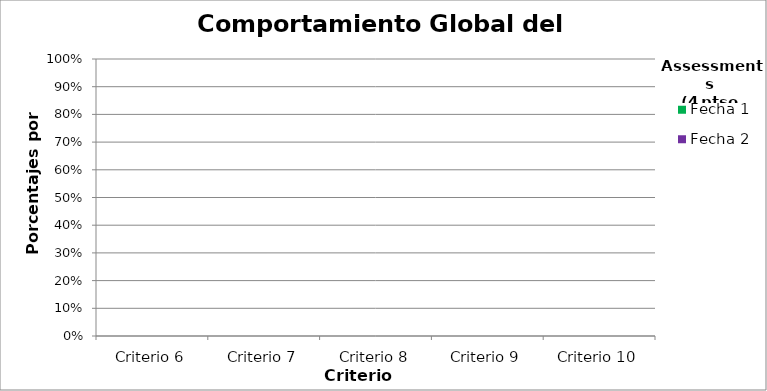
| Category | Fecha 1 | Fecha 2 |
|---|---|---|
| Criterio 6 | 0 | 0 |
| Criterio 7 | 0 | 0 |
| Criterio 8 | 0 | 0 |
| Criterio 9 | 0 | 0 |
| Criterio 10 | 0 | 0 |